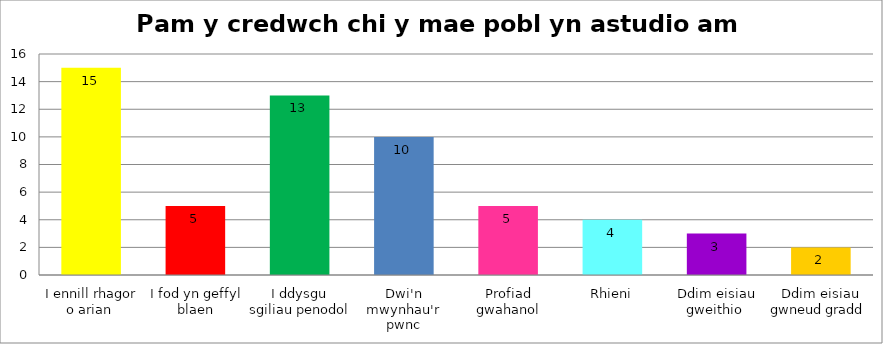
| Category | Series 0 |
|---|---|
| I ennill rhagor o arian  | 15 |
| I fod yn geffyl blaen | 5 |
| I ddysgu sgiliau penodol  | 13 |
| Dwi'n mwynhau'r pwnc | 10 |
| Profiad gwahanol | 5 |
| Rhieni | 4 |
| Ddim eisiau gweithio  | 3 |
| Ddim eisiau gwneud gradd  | 2 |